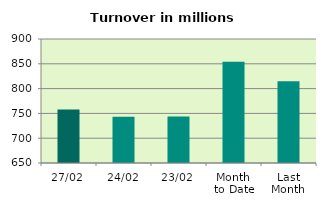
| Category | Series 0 |
|---|---|
| 27/02 | 757.733 |
| 24/02 | 743.393 |
| 23/02 | 743.568 |
| Month 
to Date | 853.932 |
| Last
Month | 814.821 |